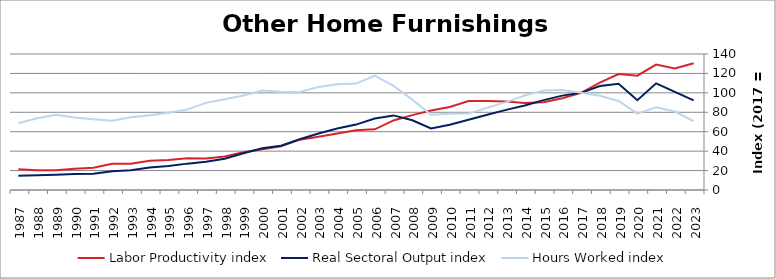
| Category | Labor Productivity index | Real Sectoral Output index | Hours Worked index |
|---|---|---|---|
| 2023.0 | 130.501 | 92.343 | 70.76 |
| 2022.0 | 125.155 | 101.055 | 80.744 |
| 2021.0 | 129.045 | 109.798 | 85.085 |
| 2020.0 | 117.67 | 92.429 | 78.549 |
| 2019.0 | 119.355 | 109.332 | 91.602 |
| 2018.0 | 110.44 | 107.04 | 96.921 |
| 2017.0 | 100 | 100 | 100 |
| 2016.0 | 94.37 | 97.154 | 102.95 |
| 2015.0 | 90.355 | 92.505 | 102.379 |
| 2014.0 | 89.518 | 87.011 | 97.199 |
| 2013.0 | 91.211 | 82.478 | 90.425 |
| 2012.0 | 91.584 | 77.482 | 84.602 |
| 2011.0 | 91.635 | 72.23 | 78.823 |
| 2010.0 | 85.443 | 67.076 | 78.503 |
| 2009.0 | 81.795 | 63.4 | 77.511 |
| 2008.0 | 77.085 | 71.729 | 93.051 |
| 2007.0 | 71.622 | 76.79 | 107.216 |
| 2006.0 | 62.503 | 73.539 | 117.658 |
| 2005.0 | 61.48 | 67.342 | 109.535 |
| 2004.0 | 58.096 | 63.246 | 108.865 |
| 2003.0 | 54.897 | 58.181 | 105.983 |
| 2002.0 | 51.842 | 52.279 | 100.843 |
| 2001.0 | 45.101 | 45.641 | 101.198 |
| 2000.0 | 42.01 | 43.018 | 102.4 |
| 1999.0 | 38.87 | 37.796 | 97.238 |
| 1998.0 | 34.458 | 32.159 | 93.327 |
| 1997.0 | 32.529 | 29.169 | 89.671 |
| 1996.0 | 32.796 | 27.144 | 82.765 |
| 1995.0 | 30.995 | 24.684 | 79.638 |
| 1994.0 | 30.028 | 23.108 | 76.954 |
| 1993.0 | 27.142 | 20.301 | 74.798 |
| 1992.0 | 27.024 | 19.278 | 71.336 |
| 1991.0 | 22.829 | 16.613 | 72.77 |
| 1990.0 | 21.974 | 16.393 | 74.602 |
| 1989.0 | 20.423 | 15.82 | 77.46 |
| 1988.0 | 20.433 | 15.102 | 73.91 |
| 1987.0 | 21.256 | 14.602 | 68.698 |